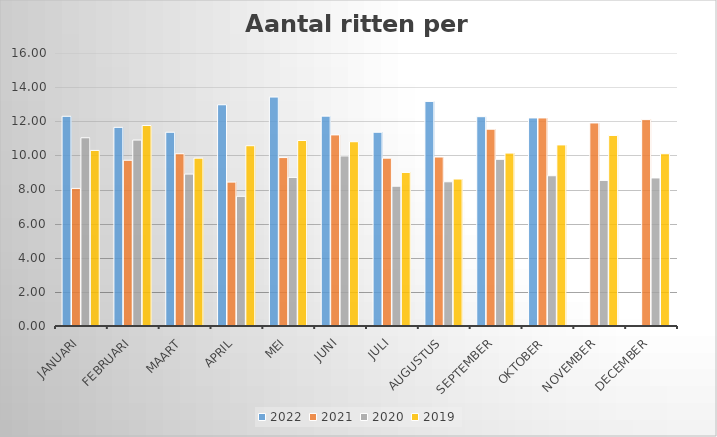
| Category | 2022 | 2021 | 2020 | 2019 |
|---|---|---|---|---|
| januari | 12.29 | 8.065 | 11.032 | 10.29 |
| februari | 11.643 | 9.714 | 10.897 | 11.75 |
| maart | 11.355 | 10.097 | 8.903 | 9.839 |
| april | 12.967 | 8.433 | 7.6 | 10.567 |
| mei | 13.419 | 9.871 | 8.71 | 10.871 |
| juni | 12.3 | 11.2 | 9.967 | 10.8 |
| juli | 11.355 | 9.839 | 8.194 | 9 |
| augustus | 13.161 | 9.903 | 8.452 | 8.613 |
| september | 12.267 | 11.533 | 9.767 | 10.133 |
| oktober | 12.194 | 12.194 | 8.806 | 10.613 |
| november | 0 | 11.9 | 8.533 | 11.167 |
| december | 0 | 12.097 | 8.677 | 10.097 |